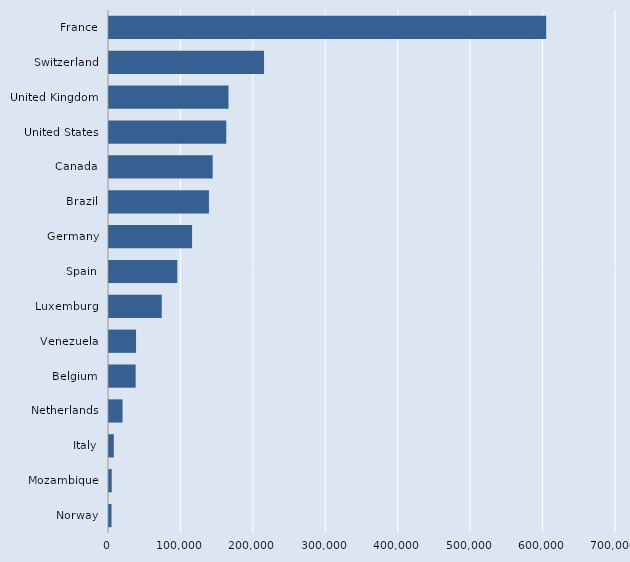
| Category | Series 0 |
|---|---|
| Norway | 3493 |
| Mozambique | 3767 |
| Italy | 6657 |
| Netherlands | 18713 |
| Belgium | 36828 |
| Venezuela | 37326 |
| Luxemburg | 72821 |
| Spain | 94319 |
| Germany | 114705 |
| Brazil | 137973 |
| Canada | 143160 |
| United States | 161936 |
| United Kingdom | 165000 |
| Switzerland | 214087 |
| France | 603600 |